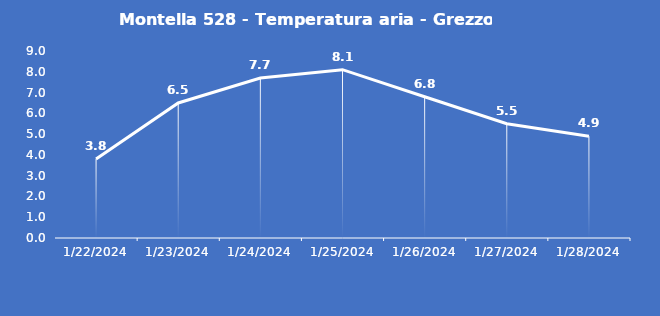
| Category | Montella 528 - Temperatura aria - Grezzo (°C) |
|---|---|
| 1/22/24 | 3.8 |
| 1/23/24 | 6.5 |
| 1/24/24 | 7.7 |
| 1/25/24 | 8.1 |
| 1/26/24 | 6.8 |
| 1/27/24 | 5.5 |
| 1/28/24 | 4.9 |